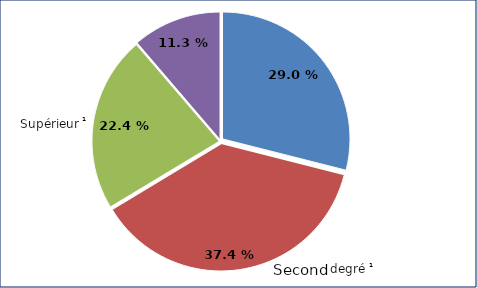
| Category | Series 0 |
|---|---|
| Premier degré | 0.29 |
| Second degré | 0.374 |
| Supérieur | 0.224 |
| Extrascolaire | 0.113 |